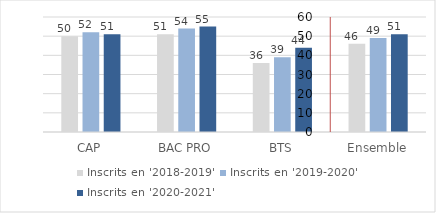
| Category | Inscrits en '2018-2019' | Inscrits en '2019-2020' | Inscrits en '2020-2021' |
|---|---|---|---|
| CAP | 50 | 52 | 51 |
| BAC PRO | 51 | 54 | 55 |
| BTS | 36 | 39 | 44 |
| Ensemble | 46 | 49 | 51 |